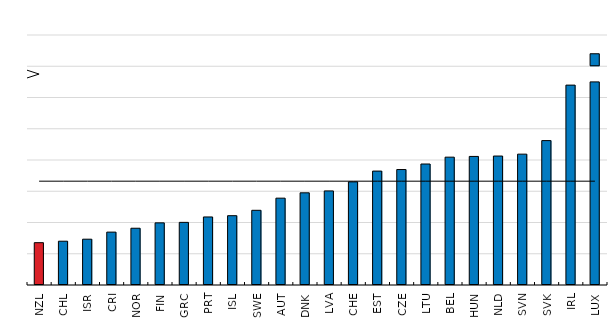
| Category | Series 0 | Series 1 | Series 2 |
|---|---|---|---|
| NZL | 27.081 |  |  |
| CHL | 28.023 |  |  |
| ISR | 29.319 |  |  |
| CRI | 33.849 |  |  |
| NOR | 36.324 |  |  |
| FIN | 39.777 |  |  |
| GRC | 40.082 |  |  |
| PRT | 43.544 |  |  |
| ISL | 44.358 |  |  |
| SWE | 47.809 |  |  |
| AUT | 55.576 |  |  |
| DNK | 58.999 |  |  |
| LVA | 60.212 |  |  |
| CHE | 66.002 |  |  |
| EST | 72.909 |  |  |
| CZE | 73.894 |  |  |
| LTU | 77.433 |  |  |
| BEL | 81.813 |  |  |
| HUN | 82.284 |  |  |
| NLD | 82.538 |  |  |
| SVN | 83.743 |  |  |
| SVK | 92.41 |  |  |
| IRL | 127.928 |  |  |
| LUX | 130 |  |  |